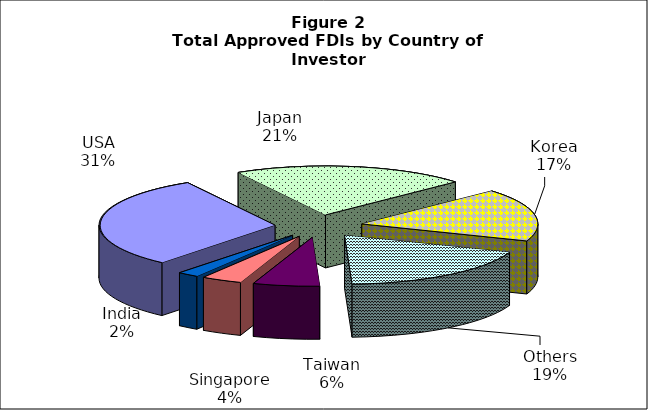
| Category | Series 0 |
|---|---|
| USA | 6743.991 |
| Japan | 4728.575 |
| Korea | 3844.177 |
| Others | 4108.214 |
| Taiwan | 1345.287 |
| Singapore | 823.534 |
| India | 428.253 |